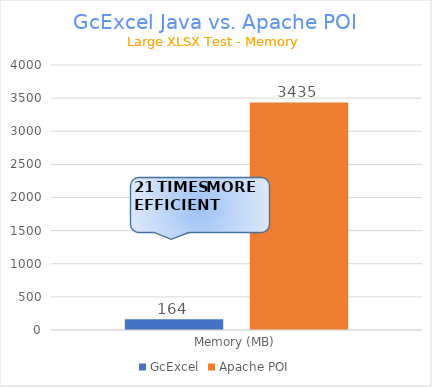
| Category | GcExcel | Apache POI |
|---|---|---|
| Memory (MB) | 163.676 | 3434.888 |